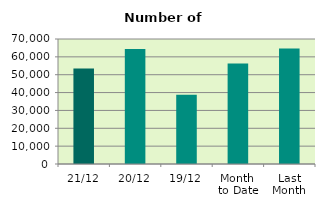
| Category | Series 0 |
|---|---|
| 21/12 | 53490 |
| 20/12 | 64436 |
| 19/12 | 38800 |
| Month 
to Date | 56238.8 |
| Last
Month | 64659.273 |